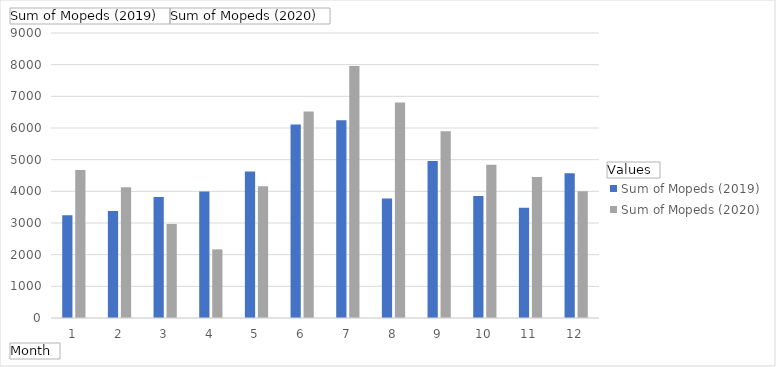
| Category | Sum of Mopeds (2019) | Sum of Mopeds (2020) |
|---|---|---|
| 1 | 3247 | 4672 |
| 2 | 3378 | 4128 |
| 3 | 3819 | 2972 |
| 4 | 3998 | 2167 |
| 5 | 4629 | 4159 |
| 6 | 6113 | 6523 |
| 7 | 6243 | 7960 |
| 8 | 3773 | 6802 |
| 9 | 4958 | 5894 |
| 10 | 3849 | 4836 |
| 11 | 3484 | 4451 |
| 12 | 4570 | 4005 |